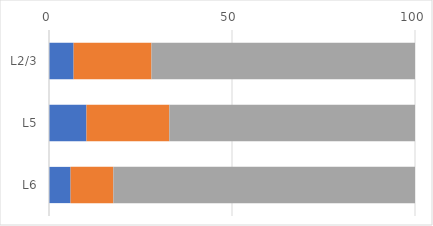
| Category | Series 0 | Series 1 | Series 2 |
|---|---|---|---|
| L2/3 | 6.726 | 21.272 | 72.002 |
| L5 | 10.238 | 22.639 | 67.123 |
| L6 | 5.895 | 11.683 | 82.422 |